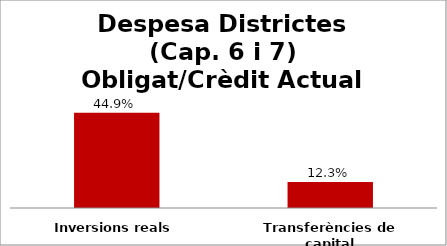
| Category | Series 0 |
|---|---|
| Inversions reals | 0.449 |
| Transferències de capital | 0.123 |